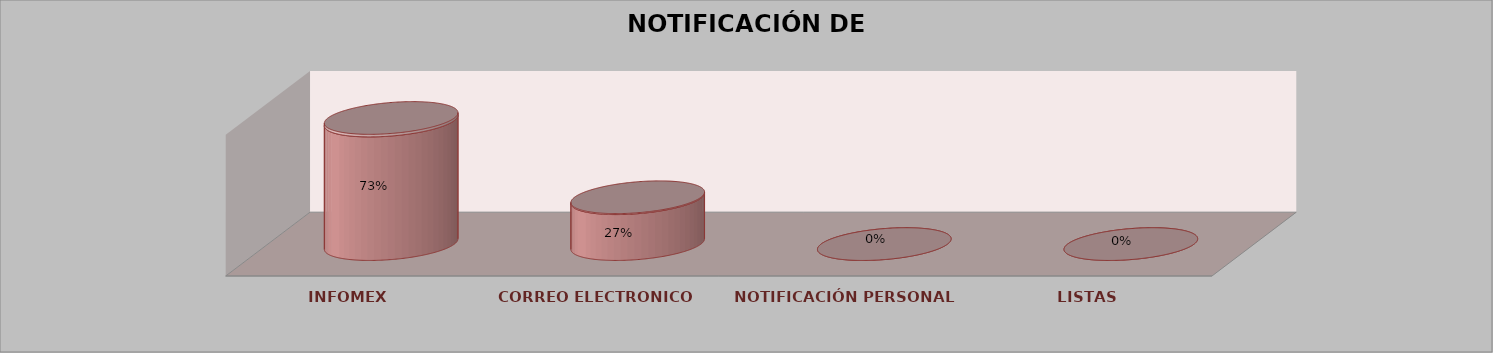
| Category | Series 0 | Series 1 | Series 2 | Series 3 | Series 4 |
|---|---|---|---|---|---|
| INFOMEX |  |  |  | 35 | 0.729 |
| CORREO ELECTRONICO |  |  |  | 13 | 0.271 |
| NOTIFICACIÓN PERSONAL |  |  |  | 0 | 0 |
| LISTAS |  |  |  | 0 | 0 |